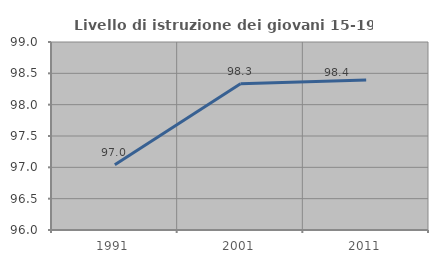
| Category | Livello di istruzione dei giovani 15-19 anni |
|---|---|
| 1991.0 | 97.04 |
| 2001.0 | 98.333 |
| 2011.0 | 98.395 |